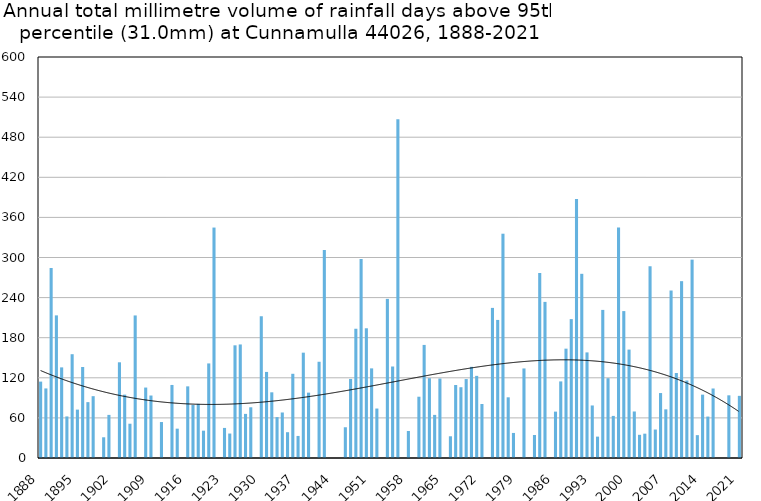
| Category | Annual total mm in days above 95th percentile |
|---|---|
| 1888 | 114.3 |
| 1889 | 104.1 |
| 1890 | 284.3 |
| 1891 | 213.4 |
| 1892 | 135.6 |
| 1893 | 62.2 |
| 1894 | 155.3 |
| 1895 | 72.4 |
| 1896 | 136.2 |
| 1897 | 83.6 |
| 1898 | 92.5 |
| 1899 | 0 |
| 1900 | 31 |
| 1901 | 64.5 |
| 1902 | 0 |
| 1903 | 143.2 |
| 1904 | 94.8 |
| 1905 | 51.3 |
| 1906 | 213.3 |
| 1907 | 0 |
| 1908 | 105.4 |
| 1909 | 93.5 |
| 1910 | 0 |
| 1911 | 53.8 |
| 1912 | 0 |
| 1913 | 109.3 |
| 1914 | 43.9 |
| 1915 | 0 |
| 1916 | 107.2 |
| 1917 | 79.3 |
| 1918 | 81 |
| 1919 | 40.9 |
| 1920 | 141.5 |
| 1921 | 344.8 |
| 1922 | 0 |
| 1923 | 45 |
| 1924 | 36.6 |
| 1925 | 168.6 |
| 1926 | 169.9 |
| 1927 | 66 |
| 1928 | 75.9 |
| 1929 | 0 |
| 1930 | 212.1 |
| 1931 | 128.8 |
| 1932 | 98.3 |
| 1933 | 61.2 |
| 1934 | 68.1 |
| 1935 | 38.6 |
| 1936 | 126 |
| 1937 | 33 |
| 1938 | 157.6 |
| 1939 | 97.8 |
| 1940 | 0 |
| 1941 | 144 |
| 1942 | 311.2 |
| 1943 | 0 |
| 1944 | 0 |
| 1945 | 0 |
| 1946 | 46 |
| 1947 | 118.3 |
| 1948 | 193.4 |
| 1949 | 297.8 |
| 1950 | 194.1 |
| 1951 | 134.1 |
| 1952 | 74 |
| 1953 | 0 |
| 1954 | 238.1 |
| 1955 | 136.9 |
| 1956 | 506.7 |
| 1957 | 0 |
| 1958 | 40.4 |
| 1959 | 0 |
| 1960 | 91.7 |
| 1961 | 169.2 |
| 1962 | 119.4 |
| 1963 | 64.5 |
| 1964 | 118.9 |
| 1965 | 0 |
| 1966 | 32.5 |
| 1967 | 109.2 |
| 1968 | 105.9 |
| 1969 | 118.1 |
| 1970 | 136.4 |
| 1971 | 122.9 |
| 1972 | 80.8 |
| 1973 | 0 |
| 1974 | 224.6 |
| 1975 | 206.6 |
| 1976 | 335.6 |
| 1977 | 90.8 |
| 1978 | 37.5 |
| 1979 | 0 |
| 1980 | 134 |
| 1981 | 0 |
| 1982 | 34.4 |
| 1983 | 276.8 |
| 1984 | 233.6 |
| 1985 | 0 |
| 1986 | 69.4 |
| 1987 | 114.6 |
| 1988 | 163.6 |
| 1989 | 207.8 |
| 1990 | 387.6 |
| 1991 | 275.6 |
| 1992 | 158 |
| 1993 | 78.6 |
| 1994 | 32 |
| 1995 | 221.6 |
| 1996 | 119.4 |
| 1997 | 63 |
| 1998 | 344.8 |
| 1999 | 219.8 |
| 2000 | 162.2 |
| 2001 | 69.6 |
| 2002 | 34.7 |
| 2003 | 36.4 |
| 2004 | 286.9 |
| 2005 | 42.6 |
| 2006 | 97.2 |
| 2007 | 72.8 |
| 2008 | 250.6 |
| 2009 | 127.2 |
| 2010 | 264.6 |
| 2011 | 116 |
| 2012 | 296.8 |
| 2013 | 34.2 |
| 2014 | 94.8 |
| 2015 | 62 |
| 2016 | 104 |
| 2017 | 0 |
| 2018 | 0 |
| 2019 | 93.8 |
| 2020 | 0 |
| 2021 | 93 |